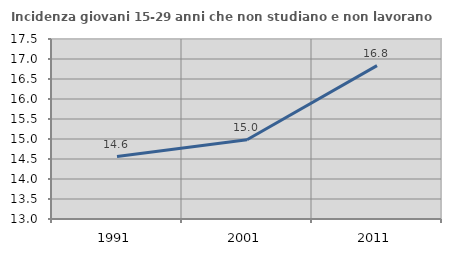
| Category | Incidenza giovani 15-29 anni che non studiano e non lavorano  |
|---|---|
| 1991.0 | 14.562 |
| 2001.0 | 14.981 |
| 2011.0 | 16.835 |